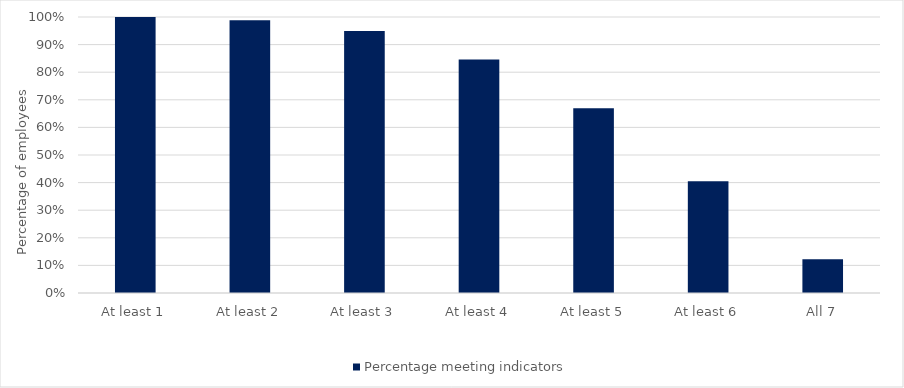
| Category | Percentage meeting indicators |
|---|---|
| At least 1 | 1 |
| At least 2 | 0.988 |
| At least 3 | 0.95 |
| At least 4 | 0.846 |
| At least 5 | 0.67 |
| At least 6 | 0.405 |
| All 7 | 0.122 |